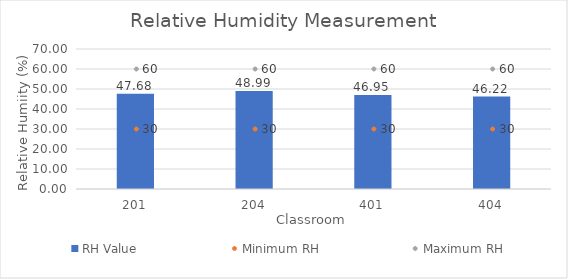
| Category | RH Value |
|---|---|
| 201.0 | 47.683 |
| 204.0 | 48.992 |
| 401.0 | 46.945 |
| 404.0 | 46.215 |